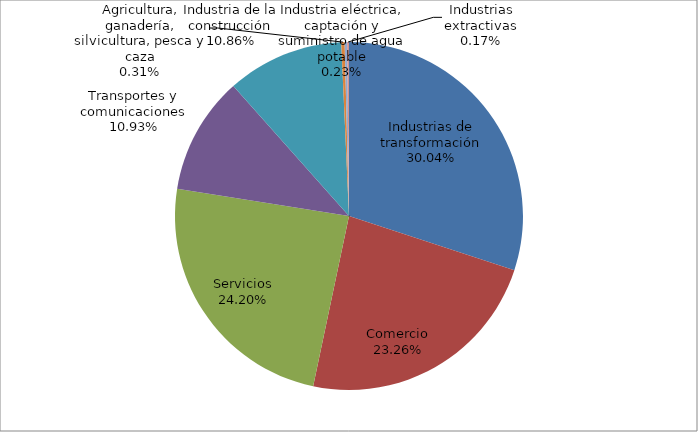
| Category | Series 0 |
|---|---|
| Industrias de transformación | 33469 |
| Comercio | 25919 |
| Servicios | 26959 |
| Transportes y comunicaciones | 12173 |
| Industria de la construcción | 12103 |
| Agricultura, ganadería, silvicultura, pesca y caza | 345 |
| Industria eléctrica, captación y suministro de agua potable | 261 |
| Industrias extractivas | 185 |